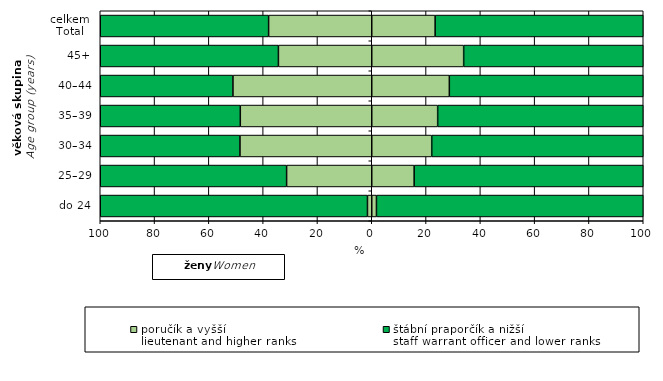
| Category | poručík a vyšší  
lieutenant and higher ranks | štábní praporčík a nižší 
staff warrant officer and lower ranks | poručík a vyšší 
lieutenant and higher ranks |
|---|---|---|---|
| do 24 | -1.573 | 98.269 | 1.731 |
| 25–29 | -31.356 | 84.387 | 15.613 |
| 30–34 | -48.544 | 77.912 | 22.088 |
| 35–39 | -48.414 | 75.725 | 24.275 |
| 40–44 | -51.127 | 71.425 | 28.575 |
| 45+ | -34.379 | 66.145 | 33.855 |
| celkem
Total | -37.987 | 76.655 | 23.345 |